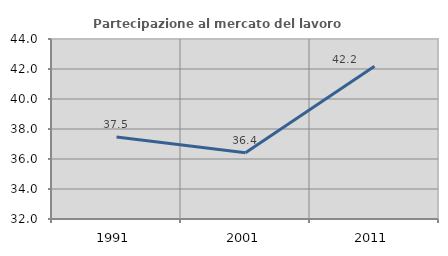
| Category | Partecipazione al mercato del lavoro  femminile |
|---|---|
| 1991.0 | 37.473 |
| 2001.0 | 36.416 |
| 2011.0 | 42.188 |